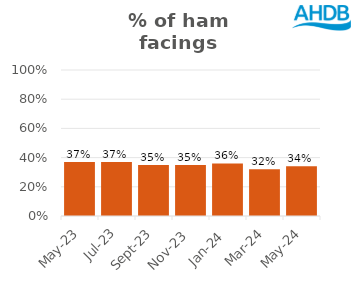
| Category | Ham |
|---|---|
| 2023-05-01 | 0.37 |
| 2023-07-01 | 0.37 |
| 2023-09-01 | 0.35 |
| 2023-11-01 | 0.35 |
| 2024-01-01 | 0.36 |
| 2024-03-01 | 0.32 |
| 2024-05-01 | 0.34 |